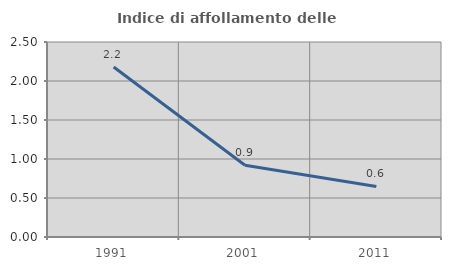
| Category | Indice di affollamento delle abitazioni  |
|---|---|
| 1991.0 | 2.179 |
| 2001.0 | 0.92 |
| 2011.0 | 0.649 |